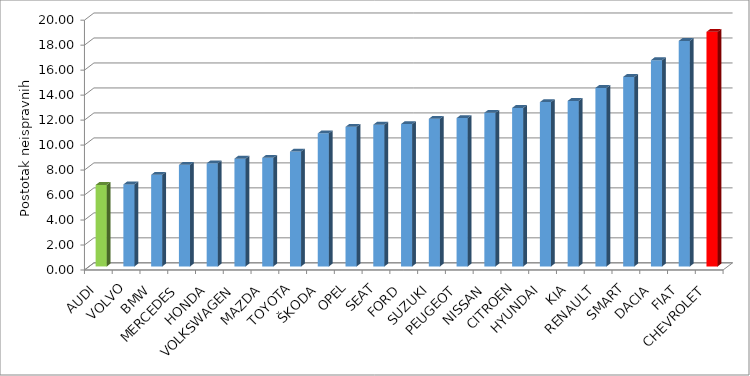
| Category | Series 4 |
|---|---|
| AUDI | 6.526 |
| VOLVO | 6.568 |
| BMW | 7.34 |
| MERCEDES | 8.132 |
| HONDA | 8.256 |
| VOLKSWAGEN | 8.631 |
| MAZDA | 8.698 |
| TOYOTA | 9.193 |
| ŠKODA | 10.654 |
| OPEL | 11.178 |
| SEAT | 11.35 |
| FORD | 11.399 |
| SUZUKI | 11.819 |
| PEUGEOT | 11.88 |
| NISSAN | 12.303 |
| CITROEN | 12.692 |
| HYUNDAI | 13.155 |
| KIA | 13.252 |
| RENAULT | 14.293 |
| SMART | 15.174 |
| DACIA | 16.515 |
| FIAT | 18.054 |
| CHEVROLET | 18.782 |